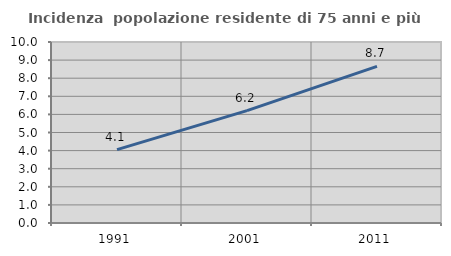
| Category | Incidenza  popolazione residente di 75 anni e più |
|---|---|
| 1991.0 | 4.052 |
| 2001.0 | 6.206 |
| 2011.0 | 8.656 |